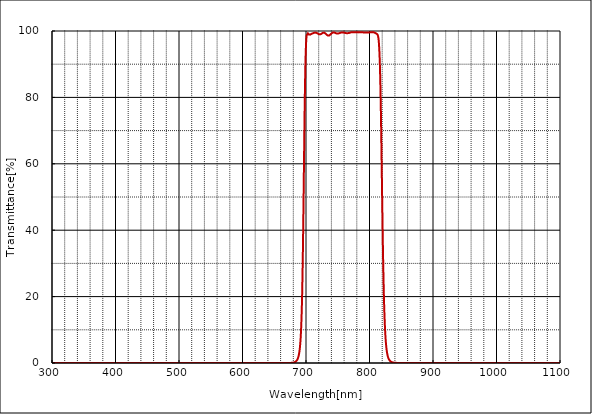
| Category | T% at AOI 0 deg |
|---|---|
| 1100.0 | 0 |
| 1099.5 | -0.001 |
| 1099.0 | 0.002 |
| 1098.5 | 0.001 |
| 1098.0 | -0.001 |
| 1097.5 | 0 |
| 1097.0 | 0.002 |
| 1096.5 | 0.001 |
| 1096.0 | 0.001 |
| 1095.5 | 0.001 |
| 1095.0 | 0.001 |
| 1094.5 | 0.001 |
| 1094.0 | 0.001 |
| 1093.5 | 0 |
| 1093.0 | 0.001 |
| 1092.5 | -0.001 |
| 1092.0 | 0 |
| 1091.5 | 0.001 |
| 1091.0 | 0.001 |
| 1090.5 | 0 |
| 1090.0 | 0.001 |
| 1089.5 | 0.001 |
| 1089.0 | 0.001 |
| 1088.5 | 0.002 |
| 1088.0 | 0.001 |
| 1087.5 | 0.002 |
| 1087.0 | -0.001 |
| 1086.5 | -0.001 |
| 1086.0 | 0.002 |
| 1085.5 | 0.002 |
| 1085.0 | 0 |
| 1084.5 | 0 |
| 1084.0 | 0 |
| 1083.5 | 0.001 |
| 1083.0 | -0.001 |
| 1082.5 | 0 |
| 1082.0 | 0.001 |
| 1081.5 | 0.001 |
| 1081.0 | 0.001 |
| 1080.5 | 0 |
| 1080.0 | 0 |
| 1079.5 | 0 |
| 1079.0 | 0.001 |
| 1078.5 | -0.001 |
| 1078.0 | 0.002 |
| 1077.5 | 0 |
| 1077.0 | 0.001 |
| 1076.5 | 0 |
| 1076.0 | 0.001 |
| 1075.5 | 0 |
| 1075.0 | -0.001 |
| 1074.5 | 0 |
| 1074.0 | 0 |
| 1073.5 | -0.001 |
| 1073.0 | 0 |
| 1072.5 | 0.001 |
| 1072.0 | 0.001 |
| 1071.5 | 0 |
| 1071.0 | 0 |
| 1070.5 | 0.001 |
| 1070.0 | 0 |
| 1069.5 | 0.001 |
| 1069.0 | 0 |
| 1068.5 | 0 |
| 1068.0 | 0 |
| 1067.5 | 0 |
| 1067.0 | 0 |
| 1066.5 | 0.001 |
| 1066.0 | 0 |
| 1065.5 | 0 |
| 1065.0 | 0 |
| 1064.5 | 0.001 |
| 1064.0 | 0.002 |
| 1063.5 | 0.001 |
| 1063.0 | 0 |
| 1062.5 | -0.001 |
| 1062.0 | -0.001 |
| 1061.5 | 0 |
| 1061.0 | 0.001 |
| 1060.5 | 0 |
| 1060.0 | 0.001 |
| 1059.5 | 0.001 |
| 1059.0 | -0.001 |
| 1058.5 | 0 |
| 1058.0 | -0.001 |
| 1057.5 | 0 |
| 1057.0 | 0.001 |
| 1056.5 | 0 |
| 1056.0 | 0 |
| 1055.5 | 0.001 |
| 1055.0 | 0.001 |
| 1054.5 | -0.001 |
| 1054.0 | 0 |
| 1053.5 | 0 |
| 1053.0 | 0 |
| 1052.5 | 0.001 |
| 1052.0 | 0 |
| 1051.5 | 0 |
| 1051.0 | 0 |
| 1050.5 | 0 |
| 1050.0 | 0 |
| 1049.5 | 0 |
| 1049.0 | 0 |
| 1048.5 | 0.001 |
| 1048.0 | 0 |
| 1047.5 | 0 |
| 1047.0 | 0 |
| 1046.5 | 0.002 |
| 1046.0 | 0.001 |
| 1045.5 | 0 |
| 1045.0 | 0 |
| 1044.5 | 0.001 |
| 1044.0 | 0.002 |
| 1043.5 | 0 |
| 1043.0 | 0 |
| 1042.5 | 0 |
| 1042.0 | 0 |
| 1041.5 | 0 |
| 1041.0 | 0 |
| 1040.5 | 0 |
| 1040.0 | 0.001 |
| 1039.5 | 0 |
| 1039.0 | -0.001 |
| 1038.5 | 0 |
| 1038.0 | 0 |
| 1037.5 | 0 |
| 1037.0 | -0.001 |
| 1036.5 | 0 |
| 1036.0 | 0 |
| 1035.5 | 0 |
| 1035.0 | 0 |
| 1034.5 | 0 |
| 1034.0 | -0.001 |
| 1033.5 | 0 |
| 1033.0 | 0.001 |
| 1032.5 | 0 |
| 1032.0 | -0.001 |
| 1031.5 | 0.001 |
| 1031.0 | -0.001 |
| 1030.5 | -0.001 |
| 1030.0 | 0.001 |
| 1029.5 | 0.001 |
| 1029.0 | -0.001 |
| 1028.5 | 0.001 |
| 1028.0 | 0.001 |
| 1027.5 | 0.001 |
| 1027.0 | 0 |
| 1026.5 | -0.001 |
| 1026.0 | 0.001 |
| 1025.5 | 0 |
| 1025.0 | 0 |
| 1024.5 | 0 |
| 1024.0 | 0 |
| 1023.5 | 0 |
| 1023.0 | -0.001 |
| 1022.5 | 0 |
| 1022.0 | 0.001 |
| 1021.5 | 0.001 |
| 1021.0 | 0 |
| 1020.5 | -0.001 |
| 1020.0 | 0 |
| 1019.5 | 0.001 |
| 1019.0 | -0.001 |
| 1018.5 | 0 |
| 1018.0 | 0.001 |
| 1017.5 | -0.001 |
| 1017.0 | 0.001 |
| 1016.5 | 0 |
| 1016.0 | 0 |
| 1015.5 | 0 |
| 1015.0 | 0.001 |
| 1014.5 | 0.001 |
| 1014.0 | 0 |
| 1013.5 | 0.002 |
| 1013.0 | 0 |
| 1012.5 | 0 |
| 1012.0 | 0 |
| 1011.5 | 0 |
| 1011.0 | 0.001 |
| 1010.5 | -0.001 |
| 1010.0 | -0.001 |
| 1009.5 | 0.001 |
| 1009.0 | -0.002 |
| 1008.5 | 0 |
| 1008.0 | 0.001 |
| 1007.5 | 0 |
| 1007.0 | 0.002 |
| 1006.5 | 0 |
| 1006.0 | 0 |
| 1005.5 | 0 |
| 1005.0 | -0.001 |
| 1004.5 | 0.001 |
| 1004.0 | 0.001 |
| 1003.5 | 0 |
| 1003.0 | 0 |
| 1002.5 | -0.001 |
| 1002.0 | 0.001 |
| 1001.5 | -0.001 |
| 1001.0 | 0.001 |
| 1000.5 | 0 |
| 1000.0 | 0.001 |
| 999.5 | 0.001 |
| 999.0 | -0.001 |
| 998.5 | 0 |
| 998.0 | 0 |
| 997.5 | 0.001 |
| 997.0 | 0 |
| 996.5 | 0.002 |
| 996.0 | 0 |
| 995.5 | 0.001 |
| 995.0 | 0 |
| 994.5 | 0 |
| 994.0 | 0 |
| 993.5 | 0 |
| 993.0 | 0 |
| 992.5 | 0.001 |
| 992.0 | 0.001 |
| 991.5 | 0 |
| 991.0 | 0 |
| 990.5 | 0 |
| 990.0 | 0.002 |
| 989.5 | 0 |
| 989.0 | 0 |
| 988.5 | 0.001 |
| 988.0 | 0.001 |
| 987.5 | 0.001 |
| 987.0 | 0.001 |
| 986.5 | -0.001 |
| 986.0 | 0 |
| 985.5 | 0 |
| 985.0 | 0 |
| 984.5 | -0.001 |
| 984.0 | 0.001 |
| 983.5 | 0.001 |
| 983.0 | -0.001 |
| 982.5 | 0.001 |
| 982.0 | 0.001 |
| 981.5 | 0.001 |
| 981.0 | -0.001 |
| 980.5 | 0.001 |
| 980.0 | 0.001 |
| 979.5 | 0 |
| 979.0 | -0.002 |
| 978.5 | 0 |
| 978.0 | 0 |
| 977.5 | 0 |
| 977.0 | 0.001 |
| 976.5 | 0 |
| 976.0 | 0.002 |
| 975.5 | 0.001 |
| 975.0 | 0 |
| 974.5 | 0.001 |
| 974.0 | 0 |
| 973.5 | 0 |
| 973.0 | 0.001 |
| 972.5 | -0.001 |
| 972.0 | 0 |
| 971.5 | 0 |
| 971.0 | 0 |
| 970.5 | 0 |
| 970.0 | 0 |
| 969.5 | 0 |
| 969.0 | 0.002 |
| 968.5 | 0 |
| 968.0 | 0 |
| 967.5 | -0.001 |
| 967.0 | -0.001 |
| 966.5 | 0.001 |
| 966.0 | 0 |
| 965.5 | 0.001 |
| 965.0 | 0 |
| 964.5 | 0.001 |
| 964.0 | 0.001 |
| 963.5 | -0.001 |
| 963.0 | 0.001 |
| 962.5 | 0 |
| 962.0 | 0 |
| 961.5 | 0.001 |
| 961.0 | -0.001 |
| 960.5 | 0 |
| 960.0 | 0.002 |
| 959.5 | 0.001 |
| 959.0 | 0.001 |
| 958.5 | 0 |
| 958.0 | 0.001 |
| 957.5 | 0 |
| 957.0 | 0 |
| 956.5 | 0.001 |
| 956.0 | 0 |
| 955.5 | 0.001 |
| 955.0 | 0.001 |
| 954.5 | 0 |
| 954.0 | 0.001 |
| 953.5 | 0 |
| 953.0 | 0.001 |
| 952.5 | 0.001 |
| 952.0 | 0.001 |
| 951.5 | 0 |
| 951.0 | 0.001 |
| 950.5 | 0 |
| 950.0 | 0.001 |
| 949.5 | -0.001 |
| 949.0 | 0 |
| 948.5 | -0.001 |
| 948.0 | 0 |
| 947.5 | 0 |
| 947.0 | 0 |
| 946.5 | 0.001 |
| 946.0 | 0.002 |
| 945.5 | -0.002 |
| 945.0 | -0.001 |
| 944.5 | -0.001 |
| 944.0 | -0.002 |
| 943.5 | 0 |
| 943.0 | 0.001 |
| 942.5 | 0.001 |
| 942.0 | 0 |
| 941.5 | 0 |
| 941.0 | -0.001 |
| 940.5 | 0 |
| 940.0 | 0.002 |
| 939.5 | 0 |
| 939.0 | 0 |
| 938.5 | 0.002 |
| 938.0 | 0.002 |
| 937.5 | 0.001 |
| 937.0 | 0 |
| 936.5 | 0.001 |
| 936.0 | 0 |
| 935.5 | 0 |
| 935.0 | -0.001 |
| 934.5 | 0.001 |
| 934.0 | -0.001 |
| 933.5 | 0 |
| 933.0 | 0 |
| 932.5 | 0 |
| 932.0 | 0 |
| 931.5 | -0.001 |
| 931.0 | 0 |
| 930.5 | 0.001 |
| 930.0 | 0.001 |
| 929.5 | 0 |
| 929.0 | -0.001 |
| 928.5 | -0.001 |
| 928.0 | 0.001 |
| 927.5 | -0.001 |
| 927.0 | 0.001 |
| 926.5 | 0 |
| 926.0 | 0 |
| 925.5 | 0 |
| 925.0 | 0 |
| 924.5 | 0.002 |
| 924.0 | 0.001 |
| 923.5 | 0.001 |
| 923.0 | 0.001 |
| 922.5 | 0 |
| 922.0 | 0 |
| 921.5 | 0 |
| 921.0 | 0 |
| 920.5 | -0.001 |
| 920.0 | 0 |
| 919.5 | -0.001 |
| 919.0 | 0.001 |
| 918.5 | 0 |
| 918.0 | 0.001 |
| 917.5 | 0.001 |
| 917.0 | 0 |
| 916.5 | 0.001 |
| 916.0 | 0.001 |
| 915.5 | 0 |
| 915.0 | 0 |
| 914.5 | 0 |
| 914.0 | 0 |
| 913.5 | 0 |
| 913.0 | 0 |
| 912.5 | 0.001 |
| 912.0 | 0 |
| 911.5 | -0.001 |
| 911.0 | 0 |
| 910.5 | 0.001 |
| 910.0 | 0 |
| 909.5 | -0.001 |
| 909.0 | 0 |
| 908.5 | 0 |
| 908.0 | 0 |
| 907.5 | 0.001 |
| 907.0 | 0 |
| 906.5 | 0 |
| 906.0 | 0 |
| 905.5 | 0.002 |
| 905.0 | -0.001 |
| 904.5 | 0 |
| 904.0 | 0 |
| 903.5 | 0 |
| 903.0 | 0.001 |
| 902.5 | 0 |
| 902.0 | 0.001 |
| 901.5 | 0 |
| 901.0 | 0.001 |
| 900.5 | 0.001 |
| 900.0 | 0 |
| 899.5 | 0.001 |
| 899.0 | 0 |
| 898.5 | 0 |
| 898.0 | 0 |
| 897.5 | 0 |
| 897.0 | 0 |
| 896.5 | 0 |
| 896.0 | -0.001 |
| 895.5 | 0 |
| 895.0 | -0.001 |
| 894.5 | 0 |
| 894.0 | 0 |
| 893.5 | 0 |
| 893.0 | 0 |
| 892.5 | 0 |
| 892.0 | 0 |
| 891.5 | 0 |
| 891.0 | 0 |
| 890.5 | 0 |
| 890.0 | -0.002 |
| 889.5 | -0.001 |
| 889.0 | 0.001 |
| 888.5 | 0 |
| 888.0 | 0.001 |
| 887.5 | 0 |
| 887.0 | -0.002 |
| 886.5 | 0 |
| 886.0 | 0.001 |
| 885.5 | -0.001 |
| 885.0 | 0 |
| 884.5 | 0 |
| 884.0 | 0 |
| 883.5 | 0.001 |
| 883.0 | 0.001 |
| 882.5 | 0 |
| 882.0 | 0.001 |
| 881.5 | 0 |
| 881.0 | 0 |
| 880.5 | 0 |
| 880.0 | 0.002 |
| 879.5 | -0.001 |
| 879.0 | 0 |
| 878.5 | -0.001 |
| 878.0 | -0.001 |
| 877.5 | 0.001 |
| 877.0 | 0.001 |
| 876.5 | 0 |
| 876.0 | -0.001 |
| 875.5 | 0 |
| 875.0 | 0.001 |
| 874.5 | 0 |
| 874.0 | -0.001 |
| 873.5 | 0 |
| 873.0 | -0.001 |
| 872.5 | 0 |
| 872.0 | 0.002 |
| 871.5 | 0 |
| 871.0 | 0.001 |
| 870.5 | 0 |
| 870.0 | 0.001 |
| 869.5 | 0.001 |
| 869.0 | -0.001 |
| 868.5 | 0 |
| 868.0 | 0.001 |
| 867.5 | 0.001 |
| 867.0 | 0 |
| 866.5 | 0.001 |
| 866.0 | -0.001 |
| 865.5 | 0.002 |
| 865.0 | 0 |
| 864.5 | 0.003 |
| 864.0 | 0.002 |
| 863.5 | 0.001 |
| 863.0 | 0 |
| 862.5 | 0 |
| 862.0 | 0.001 |
| 861.5 | 0.003 |
| 861.0 | 0.002 |
| 860.5 | 0.002 |
| 860.0 | 0.003 |
| 859.5 | 0.002 |
| 859.0 | 0.002 |
| 858.5 | 0.002 |
| 858.0 | 0.001 |
| 857.5 | 0.002 |
| 857.0 | 0.002 |
| 856.5 | 0.003 |
| 856.0 | 0.004 |
| 855.5 | 0.004 |
| 855.0 | 0.003 |
| 854.5 | 0.003 |
| 854.0 | 0.003 |
| 853.5 | 0.004 |
| 853.0 | 0.004 |
| 852.5 | 0.005 |
| 852.0 | 0.006 |
| 851.5 | 0.005 |
| 851.0 | 0.005 |
| 850.5 | 0.005 |
| 850.0 | 0.004 |
| 849.5 | 0.007 |
| 849.0 | 0.008 |
| 848.5 | 0.009 |
| 848.0 | 0.01 |
| 847.5 | 0.011 |
| 847.0 | 0.012 |
| 846.5 | 0.014 |
| 846.0 | 0.016 |
| 845.5 | 0.017 |
| 845.0 | 0.02 |
| 844.5 | 0.022 |
| 844.0 | 0.024 |
| 843.5 | 0.028 |
| 843.0 | 0.031 |
| 842.5 | 0.035 |
| 842.0 | 0.04 |
| 841.5 | 0.045 |
| 841.0 | 0.05 |
| 840.5 | 0.058 |
| 840.0 | 0.066 |
| 839.5 | 0.075 |
| 839.0 | 0.085 |
| 838.5 | 0.097 |
| 838.0 | 0.113 |
| 837.5 | 0.129 |
| 837.0 | 0.149 |
| 836.5 | 0.173 |
| 836.0 | 0.199 |
| 835.5 | 0.23 |
| 835.0 | 0.269 |
| 834.5 | 0.313 |
| 834.0 | 0.364 |
| 833.5 | 0.423 |
| 833.0 | 0.497 |
| 832.5 | 0.583 |
| 832.0 | 0.684 |
| 831.5 | 0.807 |
| 831.0 | 0.956 |
| 830.5 | 1.128 |
| 830.0 | 1.342 |
| 829.5 | 1.589 |
| 829.0 | 1.892 |
| 828.5 | 2.27 |
| 828.0 | 2.713 |
| 827.5 | 3.244 |
| 827.0 | 3.918 |
| 826.5 | 4.712 |
| 826.0 | 5.688 |
| 825.5 | 6.88 |
| 825.0 | 8.343 |
| 824.5 | 10.105 |
| 824.0 | 12.23 |
| 823.5 | 14.83 |
| 823.0 | 17.911 |
| 822.5 | 21.57 |
| 822.0 | 25.893 |
| 821.5 | 30.751 |
| 821.0 | 36.247 |
| 820.5 | 42.438 |
| 820.0 | 48.906 |
| 819.5 | 55.598 |
| 819.0 | 62.477 |
| 818.5 | 68.963 |
| 818.0 | 74.947 |
| 817.5 | 80.391 |
| 817.0 | 85.017 |
| 816.5 | 88.819 |
| 816.0 | 91.815 |
| 815.5 | 94.144 |
| 815.0 | 95.873 |
| 814.5 | 97.117 |
| 814.0 | 97.916 |
| 813.5 | 98.447 |
| 813.0 | 98.745 |
| 812.5 | 98.972 |
| 812.0 | 99.123 |
| 811.5 | 99.172 |
| 811.0 | 99.257 |
| 810.5 | 99.265 |
| 810.0 | 99.282 |
| 809.5 | 99.34 |
| 809.0 | 99.38 |
| 808.5 | 99.46 |
| 808.0 | 99.486 |
| 807.5 | 99.519 |
| 807.0 | 99.582 |
| 806.5 | 99.622 |
| 806.0 | 99.647 |
| 805.5 | 99.692 |
| 805.0 | 99.696 |
| 804.5 | 99.662 |
| 804.0 | 99.64 |
| 803.5 | 99.676 |
| 803.0 | 99.688 |
| 802.5 | 99.607 |
| 802.0 | 99.607 |
| 801.5 | 99.615 |
| 801.0 | 99.602 |
| 800.5 | 99.617 |
| 800.0 | 99.511 |
| 799.5 | 99.545 |
| 799.0 | 99.541 |
| 798.5 | 99.536 |
| 798.0 | 99.537 |
| 797.5 | 99.511 |
| 797.0 | 99.565 |
| 796.5 | 99.54 |
| 796.0 | 99.543 |
| 795.5 | 99.534 |
| 795.0 | 99.546 |
| 794.5 | 99.556 |
| 794.0 | 99.567 |
| 793.5 | 99.585 |
| 793.0 | 99.565 |
| 792.5 | 99.58 |
| 792.0 | 99.568 |
| 791.5 | 99.618 |
| 791.0 | 99.578 |
| 790.5 | 99.569 |
| 790.0 | 99.59 |
| 789.5 | 99.606 |
| 789.0 | 99.574 |
| 788.5 | 99.621 |
| 788.0 | 99.614 |
| 787.5 | 99.623 |
| 787.0 | 99.589 |
| 786.5 | 99.607 |
| 786.0 | 99.631 |
| 785.5 | 99.619 |
| 785.0 | 99.583 |
| 784.5 | 99.601 |
| 784.0 | 99.576 |
| 783.5 | 99.606 |
| 783.0 | 99.591 |
| 782.5 | 99.583 |
| 782.0 | 99.573 |
| 781.5 | 99.572 |
| 781.0 | 99.611 |
| 780.5 | 99.632 |
| 780.0 | 99.621 |
| 779.5 | 99.612 |
| 779.0 | 99.605 |
| 778.5 | 99.61 |
| 778.0 | 99.636 |
| 777.5 | 99.618 |
| 777.0 | 99.622 |
| 776.5 | 99.651 |
| 776.0 | 99.669 |
| 775.5 | 99.652 |
| 775.0 | 99.676 |
| 774.5 | 99.643 |
| 774.0 | 99.654 |
| 773.5 | 99.656 |
| 773.0 | 99.654 |
| 772.5 | 99.656 |
| 772.0 | 99.646 |
| 771.5 | 99.615 |
| 771.0 | 99.593 |
| 770.5 | 99.58 |
| 770.0 | 99.587 |
| 769.5 | 99.521 |
| 769.0 | 99.509 |
| 768.5 | 99.446 |
| 768.0 | 99.451 |
| 767.5 | 99.415 |
| 767.0 | 99.39 |
| 766.5 | 99.364 |
| 766.0 | 99.349 |
| 765.5 | 99.342 |
| 765.0 | 99.354 |
| 764.5 | 99.337 |
| 764.0 | 99.331 |
| 763.5 | 99.343 |
| 763.0 | 99.339 |
| 762.5 | 99.379 |
| 762.0 | 99.365 |
| 761.5 | 99.408 |
| 761.0 | 99.444 |
| 760.5 | 99.467 |
| 760.0 | 99.495 |
| 759.5 | 99.527 |
| 759.0 | 99.524 |
| 758.5 | 99.564 |
| 758.0 | 99.569 |
| 757.5 | 99.592 |
| 757.0 | 99.592 |
| 756.5 | 99.566 |
| 756.0 | 99.584 |
| 755.5 | 99.531 |
| 755.0 | 99.534 |
| 754.5 | 99.483 |
| 754.0 | 99.487 |
| 753.5 | 99.429 |
| 753.0 | 99.377 |
| 752.5 | 99.355 |
| 752.0 | 99.306 |
| 751.5 | 99.299 |
| 751.0 | 99.238 |
| 750.5 | 99.217 |
| 750.0 | 99.226 |
| 749.5 | 99.223 |
| 749.0 | 99.226 |
| 748.5 | 99.241 |
| 748.0 | 99.284 |
| 747.5 | 99.313 |
| 747.0 | 99.348 |
| 746.5 | 99.391 |
| 746.0 | 99.433 |
| 745.5 | 99.495 |
| 745.0 | 99.511 |
| 744.5 | 99.547 |
| 744.0 | 99.605 |
| 743.5 | 99.586 |
| 743.0 | 99.596 |
| 742.5 | 99.578 |
| 742.0 | 99.531 |
| 741.5 | 99.483 |
| 741.0 | 99.411 |
| 740.5 | 99.33 |
| 740.0 | 99.266 |
| 739.5 | 99.156 |
| 739.0 | 99.046 |
| 738.5 | 98.966 |
| 738.0 | 98.874 |
| 737.5 | 98.784 |
| 737.0 | 98.687 |
| 736.5 | 98.62 |
| 736.0 | 98.6 |
| 735.5 | 98.594 |
| 735.0 | 98.6 |
| 734.5 | 98.614 |
| 734.0 | 98.657 |
| 733.5 | 98.706 |
| 733.0 | 98.802 |
| 732.5 | 98.89 |
| 732.0 | 98.979 |
| 731.5 | 99.089 |
| 731.0 | 99.178 |
| 730.5 | 99.274 |
| 730.0 | 99.356 |
| 729.5 | 99.438 |
| 729.0 | 99.485 |
| 728.5 | 99.514 |
| 728.0 | 99.514 |
| 727.5 | 99.497 |
| 727.0 | 99.479 |
| 726.5 | 99.442 |
| 726.0 | 99.376 |
| 725.5 | 99.305 |
| 725.0 | 99.256 |
| 724.5 | 99.185 |
| 724.0 | 99.112 |
| 723.5 | 99.071 |
| 723.0 | 99.024 |
| 722.5 | 98.994 |
| 722.0 | 98.97 |
| 721.5 | 98.975 |
| 721.0 | 98.988 |
| 720.5 | 99.017 |
| 720.0 | 99.051 |
| 719.5 | 99.121 |
| 719.0 | 99.188 |
| 718.5 | 99.252 |
| 718.0 | 99.286 |
| 717.5 | 99.358 |
| 717.0 | 99.401 |
| 716.5 | 99.442 |
| 716.0 | 99.48 |
| 715.5 | 99.503 |
| 715.0 | 99.519 |
| 714.5 | 99.525 |
| 714.0 | 99.505 |
| 713.5 | 99.501 |
| 713.0 | 99.47 |
| 712.5 | 99.44 |
| 712.0 | 99.42 |
| 711.5 | 99.373 |
| 711.0 | 99.321 |
| 710.5 | 99.293 |
| 710.0 | 99.248 |
| 709.5 | 99.197 |
| 709.0 | 99.162 |
| 708.5 | 99.112 |
| 708.0 | 99.05 |
| 707.5 | 98.999 |
| 707.0 | 98.953 |
| 706.5 | 98.903 |
| 706.0 | 98.88 |
| 705.5 | 98.859 |
| 705.0 | 98.903 |
| 704.5 | 98.959 |
| 704.0 | 99.059 |
| 703.5 | 99.185 |
| 703.0 | 99.294 |
| 702.5 | 99.391 |
| 702.0 | 99.386 |
| 701.5 | 99.199 |
| 701.0 | 98.652 |
| 700.5 | 97.646 |
| 700.0 | 95.923 |
| 699.5 | 93.193 |
| 699.0 | 89.407 |
| 698.5 | 84.429 |
| 698.0 | 78.125 |
| 697.5 | 70.912 |
| 697.0 | 63.019 |
| 696.5 | 54.781 |
| 696.0 | 46.691 |
| 695.5 | 39.138 |
| 695.0 | 32.303 |
| 694.5 | 26.327 |
| 694.0 | 21.376 |
| 693.5 | 17.257 |
| 693.0 | 13.868 |
| 692.5 | 11.193 |
| 692.0 | 9.047 |
| 691.5 | 7.298 |
| 691.0 | 5.932 |
| 690.5 | 4.852 |
| 690.0 | 3.962 |
| 689.5 | 3.261 |
| 689.0 | 2.691 |
| 688.5 | 2.229 |
| 688.0 | 1.852 |
| 687.5 | 1.543 |
| 687.0 | 1.289 |
| 686.5 | 1.078 |
| 686.0 | 0.902 |
| 685.5 | 0.757 |
| 685.0 | 0.634 |
| 684.5 | 0.533 |
| 684.0 | 0.448 |
| 683.5 | 0.375 |
| 683.0 | 0.315 |
| 682.5 | 0.265 |
| 682.0 | 0.222 |
| 681.5 | 0.187 |
| 681.0 | 0.158 |
| 680.5 | 0.133 |
| 680.0 | 0.112 |
| 679.5 | 0.095 |
| 679.0 | 0.08 |
| 678.5 | 0.068 |
| 678.0 | 0.058 |
| 677.5 | 0.05 |
| 677.0 | 0.043 |
| 676.5 | 0.037 |
| 676.0 | 0.032 |
| 675.5 | 0.028 |
| 675.0 | 0.024 |
| 674.5 | 0.021 |
| 674.0 | 0.019 |
| 673.5 | 0.016 |
| 673.0 | 0.015 |
| 672.5 | 0.013 |
| 672.0 | 0.012 |
| 671.5 | 0.011 |
| 671.0 | 0.01 |
| 670.5 | 0.009 |
| 670.0 | 0.008 |
| 669.5 | 0.007 |
| 669.0 | 0.007 |
| 668.5 | 0.006 |
| 668.0 | 0.006 |
| 667.5 | 0.005 |
| 667.0 | 0.005 |
| 666.5 | 0.004 |
| 666.0 | 0.004 |
| 665.5 | 0.003 |
| 665.0 | 0.003 |
| 664.5 | 0.003 |
| 664.0 | 0.002 |
| 663.5 | 0.002 |
| 663.0 | 0.002 |
| 662.5 | 0.002 |
| 662.0 | 0.001 |
| 661.5 | 0.001 |
| 661.0 | 0.001 |
| 660.5 | 0.001 |
| 660.0 | 0.001 |
| 659.5 | 0.001 |
| 659.0 | 0 |
| 658.5 | 0 |
| 658.0 | 0 |
| 657.5 | 0 |
| 657.0 | 0 |
| 656.5 | 0 |
| 656.0 | 0 |
| 655.5 | 0 |
| 655.0 | 0 |
| 654.5 | 0 |
| 654.0 | 0 |
| 653.5 | 0 |
| 653.0 | 0 |
| 652.5 | 0 |
| 652.0 | 0 |
| 651.5 | 0 |
| 651.0 | 0 |
| 650.5 | 0 |
| 650.0 | 0 |
| 649.5 | 0 |
| 649.0 | 0 |
| 648.5 | 0 |
| 648.0 | 0 |
| 647.5 | 0 |
| 647.0 | 0 |
| 646.5 | 0 |
| 646.0 | 0 |
| 645.5 | 0 |
| 645.0 | 0 |
| 644.5 | 0 |
| 644.0 | 0 |
| 643.5 | 0 |
| 643.0 | 0 |
| 642.5 | 0 |
| 642.0 | 0 |
| 641.5 | 0 |
| 641.0 | 0 |
| 640.5 | 0 |
| 640.0 | 0 |
| 639.5 | 0 |
| 639.0 | 0 |
| 638.5 | 0 |
| 638.0 | 0 |
| 637.5 | 0 |
| 637.0 | 0 |
| 636.5 | 0 |
| 636.0 | 0 |
| 635.5 | 0 |
| 635.0 | 0 |
| 634.5 | 0 |
| 634.0 | 0 |
| 633.5 | 0 |
| 633.0 | 0 |
| 632.5 | 0 |
| 632.0 | 0 |
| 631.5 | 0 |
| 631.0 | 0 |
| 630.5 | 0 |
| 630.0 | 0 |
| 629.5 | 0 |
| 629.0 | 0 |
| 628.5 | 0 |
| 628.0 | 0 |
| 627.5 | 0 |
| 627.0 | 0 |
| 626.5 | 0 |
| 626.0 | 0 |
| 625.5 | 0 |
| 625.0 | 0 |
| 624.5 | 0 |
| 624.0 | 0 |
| 623.5 | 0 |
| 623.0 | 0 |
| 622.5 | 0 |
| 622.0 | 0 |
| 621.5 | 0 |
| 621.0 | 0 |
| 620.5 | 0 |
| 620.0 | 0 |
| 619.5 | 0 |
| 619.0 | 0 |
| 618.5 | 0 |
| 618.0 | 0 |
| 617.5 | 0 |
| 617.0 | 0 |
| 616.5 | 0 |
| 616.0 | 0 |
| 615.5 | 0 |
| 615.0 | 0 |
| 614.5 | 0 |
| 614.0 | 0 |
| 613.5 | 0 |
| 613.0 | 0 |
| 612.5 | 0 |
| 612.0 | 0 |
| 611.5 | 0 |
| 611.0 | 0 |
| 610.5 | 0 |
| 610.0 | 0 |
| 609.5 | 0 |
| 609.0 | 0 |
| 608.5 | 0 |
| 608.0 | 0 |
| 607.5 | 0 |
| 607.0 | 0 |
| 606.5 | 0 |
| 606.0 | 0 |
| 605.5 | 0 |
| 605.0 | 0 |
| 604.5 | 0 |
| 604.0 | 0 |
| 603.5 | 0 |
| 603.0 | 0 |
| 602.5 | 0 |
| 602.0 | 0 |
| 601.5 | 0 |
| 601.0 | 0 |
| 600.5 | 0 |
| 600.0 | 0 |
| 599.5 | 0 |
| 599.0 | 0 |
| 598.5 | 0 |
| 598.0 | 0 |
| 597.5 | 0 |
| 597.0 | 0 |
| 596.5 | 0 |
| 596.0 | 0 |
| 595.5 | 0 |
| 595.0 | 0 |
| 594.5 | 0 |
| 594.0 | 0 |
| 593.5 | 0 |
| 593.0 | 0 |
| 592.5 | 0 |
| 592.0 | 0 |
| 591.5 | 0 |
| 591.0 | 0 |
| 590.5 | 0 |
| 590.0 | 0 |
| 589.5 | 0 |
| 589.0 | 0 |
| 588.5 | 0 |
| 588.0 | 0 |
| 587.5 | 0 |
| 587.0 | 0 |
| 586.5 | 0 |
| 586.0 | 0 |
| 585.5 | 0 |
| 585.0 | 0 |
| 584.5 | 0 |
| 584.0 | 0 |
| 583.5 | 0 |
| 583.0 | 0 |
| 582.5 | 0 |
| 582.0 | 0 |
| 581.5 | 0 |
| 581.0 | 0 |
| 580.5 | 0 |
| 580.0 | 0 |
| 579.5 | 0 |
| 579.0 | 0 |
| 578.5 | 0 |
| 578.0 | 0 |
| 577.5 | 0 |
| 577.0 | 0 |
| 576.5 | 0 |
| 576.0 | 0 |
| 575.5 | 0 |
| 575.0 | 0 |
| 574.5 | 0 |
| 574.0 | 0 |
| 573.5 | 0 |
| 573.0 | 0 |
| 572.5 | 0 |
| 572.0 | 0 |
| 571.5 | 0 |
| 571.0 | 0 |
| 570.5 | 0 |
| 570.0 | 0 |
| 569.5 | 0 |
| 569.0 | 0 |
| 568.5 | 0 |
| 568.0 | 0 |
| 567.5 | 0 |
| 567.0 | 0 |
| 566.5 | 0 |
| 566.0 | 0 |
| 565.5 | 0 |
| 565.0 | 0 |
| 564.5 | 0 |
| 564.0 | 0 |
| 563.5 | 0 |
| 563.0 | 0 |
| 562.5 | 0 |
| 562.0 | 0 |
| 561.5 | 0 |
| 561.0 | 0 |
| 560.5 | 0 |
| 560.0 | 0 |
| 559.5 | 0 |
| 559.0 | 0 |
| 558.5 | 0 |
| 558.0 | 0 |
| 557.5 | 0 |
| 557.0 | 0 |
| 556.5 | 0 |
| 556.0 | 0 |
| 555.5 | 0 |
| 555.0 | 0 |
| 554.5 | 0 |
| 554.0 | 0 |
| 553.5 | 0 |
| 553.0 | 0 |
| 552.5 | 0 |
| 552.0 | 0 |
| 551.5 | 0 |
| 551.0 | 0 |
| 550.5 | 0 |
| 550.0 | 0 |
| 549.5 | 0 |
| 549.0 | 0 |
| 548.5 | 0 |
| 548.0 | 0 |
| 547.5 | 0 |
| 547.0 | 0 |
| 546.5 | 0 |
| 546.0 | 0 |
| 545.5 | 0 |
| 545.0 | 0 |
| 544.5 | 0 |
| 544.0 | 0 |
| 543.5 | 0 |
| 543.0 | 0 |
| 542.5 | 0 |
| 542.0 | 0 |
| 541.5 | 0 |
| 541.0 | 0 |
| 540.5 | 0 |
| 540.0 | 0 |
| 539.5 | 0 |
| 539.0 | 0 |
| 538.5 | 0 |
| 538.0 | 0 |
| 537.5 | 0 |
| 537.0 | 0 |
| 536.5 | 0 |
| 536.0 | 0 |
| 535.5 | 0 |
| 535.0 | 0 |
| 534.5 | 0 |
| 534.0 | 0 |
| 533.5 | 0 |
| 533.0 | 0 |
| 532.5 | 0 |
| 532.0 | 0 |
| 531.5 | 0 |
| 531.0 | 0 |
| 530.5 | 0 |
| 530.0 | 0 |
| 529.5 | 0 |
| 529.0 | 0 |
| 528.5 | 0 |
| 528.0 | 0 |
| 527.5 | 0 |
| 527.0 | 0 |
| 526.5 | 0 |
| 526.0 | 0 |
| 525.5 | 0 |
| 525.0 | 0 |
| 524.5 | 0 |
| 524.0 | 0 |
| 523.5 | 0 |
| 523.0 | 0 |
| 522.5 | 0 |
| 522.0 | 0 |
| 521.5 | 0 |
| 521.0 | 0 |
| 520.5 | 0 |
| 520.0 | 0 |
| 519.5 | 0 |
| 519.0 | 0 |
| 518.5 | 0 |
| 518.0 | 0 |
| 517.5 | 0 |
| 517.0 | 0 |
| 516.5 | 0 |
| 516.0 | 0 |
| 515.5 | 0 |
| 515.0 | 0 |
| 514.5 | 0 |
| 514.0 | 0 |
| 513.5 | 0 |
| 513.0 | 0 |
| 512.5 | 0 |
| 512.0 | 0 |
| 511.5 | 0 |
| 511.0 | 0 |
| 510.5 | 0 |
| 510.0 | 0 |
| 509.5 | 0 |
| 509.0 | 0 |
| 508.5 | 0 |
| 508.0 | 0 |
| 507.5 | 0 |
| 507.0 | 0 |
| 506.5 | 0 |
| 506.0 | 0 |
| 505.5 | 0 |
| 505.0 | 0 |
| 504.5 | 0 |
| 504.0 | 0 |
| 503.5 | 0 |
| 503.0 | 0 |
| 502.5 | 0 |
| 502.0 | 0 |
| 501.5 | 0 |
| 501.0 | 0 |
| 500.5 | 0 |
| 500.0 | 0 |
| 499.5 | 0 |
| 499.0 | 0 |
| 498.5 | 0 |
| 498.0 | 0 |
| 497.5 | 0 |
| 497.0 | 0 |
| 496.5 | 0 |
| 496.0 | 0 |
| 495.5 | 0 |
| 495.0 | 0 |
| 494.5 | 0 |
| 494.0 | 0 |
| 493.5 | 0 |
| 493.0 | 0 |
| 492.5 | 0 |
| 492.0 | 0 |
| 491.5 | 0 |
| 491.0 | 0 |
| 490.5 | 0 |
| 490.0 | 0 |
| 489.5 | 0 |
| 489.0 | 0 |
| 488.5 | 0 |
| 488.0 | 0 |
| 487.5 | 0 |
| 487.0 | 0 |
| 486.5 | 0 |
| 486.0 | 0 |
| 485.5 | 0 |
| 485.0 | 0 |
| 484.5 | 0 |
| 484.0 | 0 |
| 483.5 | 0 |
| 483.0 | 0 |
| 482.5 | 0 |
| 482.0 | 0 |
| 481.5 | 0 |
| 481.0 | 0 |
| 480.5 | 0 |
| 480.0 | 0 |
| 479.5 | 0 |
| 479.0 | 0 |
| 478.5 | 0 |
| 478.0 | 0 |
| 477.5 | 0 |
| 477.0 | 0 |
| 476.5 | 0 |
| 476.0 | 0 |
| 475.5 | 0 |
| 475.0 | 0 |
| 474.5 | 0 |
| 474.0 | 0 |
| 473.5 | 0 |
| 473.0 | 0 |
| 472.5 | 0 |
| 472.0 | 0 |
| 471.5 | 0 |
| 471.0 | 0 |
| 470.5 | 0 |
| 470.0 | 0 |
| 469.5 | 0 |
| 469.0 | 0 |
| 468.5 | 0 |
| 468.0 | 0 |
| 467.5 | 0 |
| 467.0 | 0 |
| 466.5 | 0 |
| 466.0 | 0 |
| 465.5 | 0 |
| 465.0 | 0 |
| 464.5 | 0 |
| 464.0 | 0 |
| 463.5 | 0 |
| 463.0 | 0 |
| 462.5 | 0 |
| 462.0 | 0 |
| 461.5 | 0 |
| 461.0 | 0 |
| 460.5 | 0 |
| 460.0 | 0 |
| 459.5 | 0 |
| 459.0 | 0 |
| 458.5 | 0 |
| 458.0 | 0 |
| 457.5 | 0 |
| 457.0 | 0 |
| 456.5 | 0 |
| 456.0 | 0 |
| 455.5 | 0 |
| 455.0 | 0 |
| 454.5 | 0 |
| 454.0 | 0 |
| 453.5 | 0 |
| 453.0 | 0 |
| 452.5 | 0 |
| 452.0 | 0 |
| 451.5 | 0 |
| 451.0 | 0 |
| 450.5 | 0 |
| 450.0 | 0 |
| 449.5 | 0 |
| 449.0 | 0 |
| 448.5 | 0 |
| 448.0 | 0 |
| 447.5 | 0 |
| 447.0 | 0 |
| 446.5 | 0 |
| 446.0 | 0 |
| 445.5 | 0 |
| 445.0 | 0 |
| 444.5 | 0 |
| 444.0 | 0 |
| 443.5 | 0 |
| 443.0 | 0 |
| 442.5 | 0 |
| 442.0 | 0 |
| 441.5 | 0 |
| 441.0 | 0 |
| 440.5 | 0 |
| 440.0 | 0 |
| 439.5 | 0 |
| 439.0 | 0 |
| 438.5 | 0 |
| 438.0 | 0 |
| 437.5 | 0 |
| 437.0 | 0 |
| 436.5 | 0 |
| 436.0 | 0 |
| 435.5 | 0 |
| 435.0 | 0 |
| 434.5 | 0 |
| 434.0 | 0 |
| 433.5 | 0 |
| 433.0 | 0 |
| 432.5 | 0 |
| 432.0 | 0 |
| 431.5 | 0 |
| 431.0 | 0 |
| 430.5 | 0 |
| 430.0 | 0 |
| 429.5 | 0 |
| 429.0 | 0 |
| 428.5 | 0 |
| 428.0 | 0 |
| 427.5 | 0 |
| 427.0 | 0 |
| 426.5 | 0 |
| 426.0 | 0 |
| 425.5 | 0 |
| 425.0 | 0 |
| 424.5 | 0 |
| 424.0 | 0 |
| 423.5 | 0 |
| 423.0 | 0 |
| 422.5 | 0 |
| 422.0 | 0 |
| 421.5 | 0 |
| 421.0 | 0 |
| 420.5 | 0 |
| 420.0 | 0 |
| 419.5 | 0 |
| 419.0 | 0 |
| 418.5 | 0 |
| 418.0 | 0 |
| 417.5 | 0 |
| 417.0 | 0 |
| 416.5 | 0 |
| 416.0 | 0 |
| 415.5 | 0 |
| 415.0 | 0 |
| 414.5 | 0 |
| 414.0 | 0 |
| 413.5 | 0 |
| 413.0 | 0 |
| 412.5 | 0 |
| 412.0 | 0 |
| 411.5 | 0 |
| 411.0 | 0 |
| 410.5 | 0 |
| 410.0 | 0 |
| 409.5 | 0 |
| 409.0 | 0 |
| 408.5 | 0 |
| 408.0 | 0 |
| 407.5 | 0 |
| 407.0 | 0 |
| 406.5 | 0 |
| 406.0 | 0 |
| 405.5 | 0 |
| 405.0 | 0 |
| 404.5 | 0 |
| 404.0 | 0 |
| 403.5 | 0 |
| 403.0 | 0 |
| 402.5 | 0 |
| 402.0 | 0 |
| 401.5 | 0 |
| 401.0 | 0 |
| 400.5 | 0 |
| 400.0 | 0 |
| 399.5 | 0 |
| 399.0 | 0 |
| 398.5 | 0 |
| 398.0 | 0 |
| 397.5 | 0 |
| 397.0 | 0 |
| 396.5 | 0 |
| 396.0 | 0 |
| 395.5 | 0 |
| 395.0 | 0 |
| 394.5 | 0 |
| 394.0 | 0 |
| 393.5 | 0 |
| 393.0 | 0 |
| 392.5 | 0 |
| 392.0 | 0 |
| 391.5 | 0 |
| 391.0 | 0 |
| 390.5 | 0 |
| 390.0 | 0 |
| 389.5 | 0 |
| 389.0 | 0 |
| 388.5 | 0 |
| 388.0 | 0 |
| 387.5 | 0 |
| 387.0 | -0.001 |
| 386.5 | 0 |
| 386.0 | 0 |
| 385.5 | 0 |
| 385.0 | 0 |
| 384.5 | 0 |
| 384.0 | 0 |
| 383.5 | 0 |
| 383.0 | 0 |
| 382.5 | 0 |
| 382.0 | 0 |
| 381.5 | 0 |
| 381.0 | 0 |
| 380.5 | 0 |
| 380.0 | 0 |
| 379.5 | 0 |
| 379.0 | 0 |
| 378.5 | 0 |
| 378.0 | 0 |
| 377.5 | 0 |
| 377.0 | 0 |
| 376.5 | 0 |
| 376.0 | 0 |
| 375.5 | 0 |
| 375.0 | 0 |
| 374.5 | 0 |
| 374.0 | 0 |
| 373.5 | 0 |
| 373.0 | 0 |
| 372.5 | 0 |
| 372.0 | 0 |
| 371.5 | 0 |
| 371.0 | 0 |
| 370.5 | 0 |
| 370.0 | 0 |
| 369.5 | 0 |
| 369.0 | 0 |
| 368.5 | 0 |
| 368.0 | 0 |
| 367.5 | 0 |
| 367.0 | 0 |
| 366.5 | -0.001 |
| 366.0 | 0 |
| 365.5 | 0 |
| 365.0 | -0.001 |
| 364.5 | 0 |
| 364.0 | 0 |
| 363.5 | 0 |
| 363.0 | 0 |
| 362.5 | 0 |
| 362.0 | 0 |
| 361.5 | 0 |
| 361.0 | 0 |
| 360.5 | 0 |
| 360.0 | 0 |
| 359.5 | 0 |
| 359.0 | 0 |
| 358.5 | 0 |
| 358.0 | 0 |
| 357.5 | 0 |
| 357.0 | 0 |
| 356.5 | 0 |
| 356.0 | 0 |
| 355.5 | 0 |
| 355.0 | 0 |
| 354.5 | 0 |
| 354.0 | 0 |
| 353.5 | 0 |
| 353.0 | 0 |
| 352.5 | 0 |
| 352.0 | 0 |
| 351.5 | 0 |
| 351.0 | 0 |
| 350.5 | 0 |
| 350.0 | 0 |
| 349.5 | 0 |
| 349.0 | 0 |
| 348.5 | 0 |
| 348.0 | 0 |
| 347.5 | 0 |
| 347.0 | 0 |
| 346.5 | 0 |
| 346.0 | 0 |
| 345.5 | 0 |
| 345.0 | 0 |
| 344.5 | 0 |
| 344.0 | 0 |
| 343.5 | 0 |
| 343.0 | 0 |
| 342.5 | 0 |
| 342.0 | 0 |
| 341.5 | 0 |
| 341.0 | 0 |
| 340.5 | 0 |
| 340.0 | 0 |
| 339.5 | 0 |
| 339.0 | 0 |
| 338.5 | 0 |
| 338.0 | 0 |
| 337.5 | 0 |
| 337.0 | 0 |
| 336.5 | 0 |
| 336.0 | 0 |
| 335.5 | 0 |
| 335.0 | 0 |
| 334.5 | 0 |
| 334.0 | 0 |
| 333.5 | 0 |
| 333.0 | 0 |
| 332.5 | 0 |
| 332.0 | 0 |
| 331.5 | 0 |
| 331.0 | 0 |
| 330.5 | 0 |
| 330.0 | 0 |
| 329.5 | 0 |
| 329.0 | 0 |
| 328.5 | 0 |
| 328.0 | 0 |
| 327.5 | 0 |
| 327.0 | 0 |
| 326.5 | 0 |
| 326.0 | 0 |
| 325.5 | 0 |
| 325.0 | 0 |
| 324.5 | -0.001 |
| 324.0 | 0 |
| 323.5 | -0.001 |
| 323.0 | -0.001 |
| 322.5 | 0 |
| 322.0 | -0.001 |
| 321.5 | 0 |
| 321.0 | 0 |
| 320.5 | 0 |
| 320.0 | 0 |
| 319.5 | 0 |
| 319.0 | 0 |
| 318.5 | 0 |
| 318.0 | 0 |
| 317.5 | 0 |
| 317.0 | 0 |
| 316.5 | 0 |
| 316.0 | 0 |
| 315.5 | 0 |
| 315.0 | 0 |
| 314.5 | 0 |
| 314.0 | 0 |
| 313.5 | 0 |
| 313.0 | 0 |
| 312.5 | 0 |
| 312.0 | 0 |
| 311.5 | 0 |
| 311.0 | 0 |
| 310.5 | 0 |
| 310.0 | 0 |
| 309.5 | 0 |
| 309.0 | 0 |
| 308.5 | 0 |
| 308.0 | 0 |
| 307.5 | 0 |
| 307.0 | 0 |
| 306.5 | 0 |
| 306.0 | 0 |
| 305.5 | 0 |
| 305.0 | 0 |
| 304.5 | 0 |
| 304.0 | 0 |
| 303.5 | 0 |
| 303.0 | 0 |
| 302.5 | 0 |
| 302.0 | 0 |
| 301.5 | 0 |
| 301.0 | 0 |
| 300.5 | 0 |
| 300.0 | 0 |